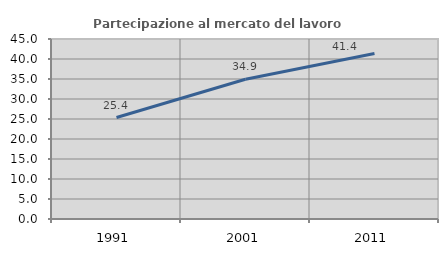
| Category | Partecipazione al mercato del lavoro  femminile |
|---|---|
| 1991.0 | 25.366 |
| 2001.0 | 34.928 |
| 2011.0 | 41.364 |